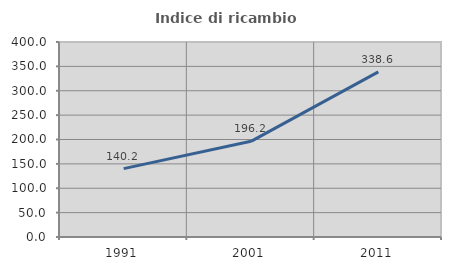
| Category | Indice di ricambio occupazionale  |
|---|---|
| 1991.0 | 140.189 |
| 2001.0 | 196.246 |
| 2011.0 | 338.645 |